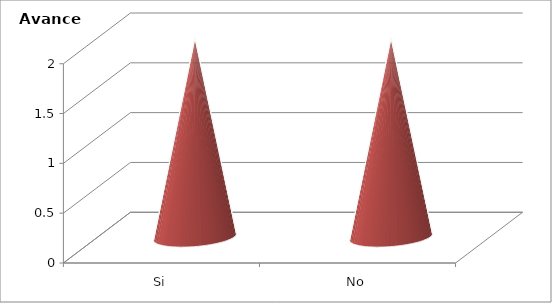
| Category | Series 0 |
|---|---|
| Si | 2 |
| No | 2 |